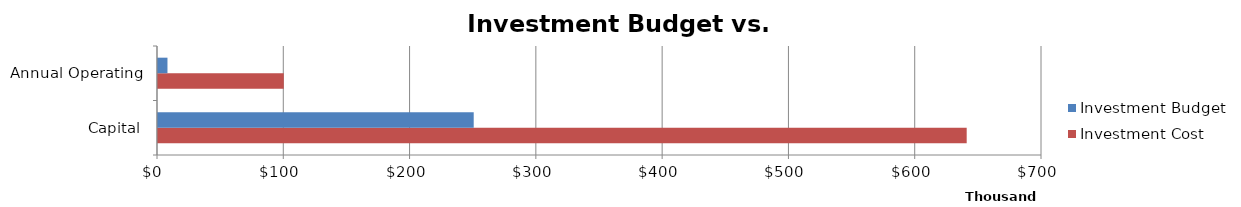
| Category | Investment Cost | Investment Budget |
|---|---|---|
| Capital | 640370.192 | 250000 |
| Annual Operating | 99600 | 7500 |